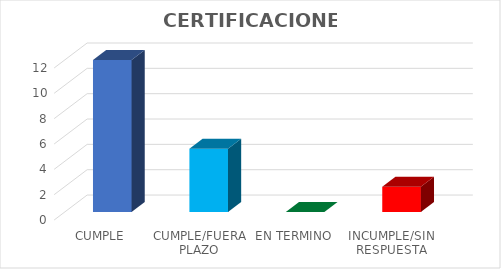
| Category | Series 0 |
|---|---|
| CUMPLE | 12 |
| CUMPLE/FUERA PLAZO | 5 |
| EN TERMINO | 0 |
| INCUMPLE/SIN RESPUESTA | 2 |